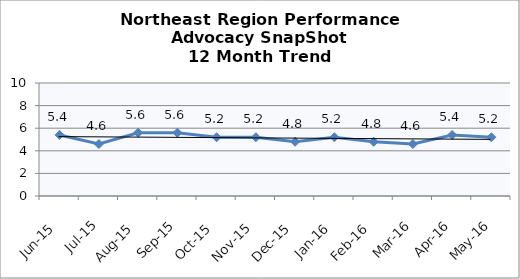
| Category | Northeast Region |
|---|---|
| Jun-15 | 5.4 |
| Jul-15 | 4.6 |
| Aug-15 | 5.6 |
| Sep-15 | 5.6 |
| Oct-15 | 5.2 |
| Nov-15 | 5.2 |
| Dec-15 | 4.8 |
| Jan-16 | 5.2 |
| Feb-16 | 4.8 |
| Mar-16 | 4.6 |
| Apr-16 | 5.4 |
| May-16 | 5.2 |